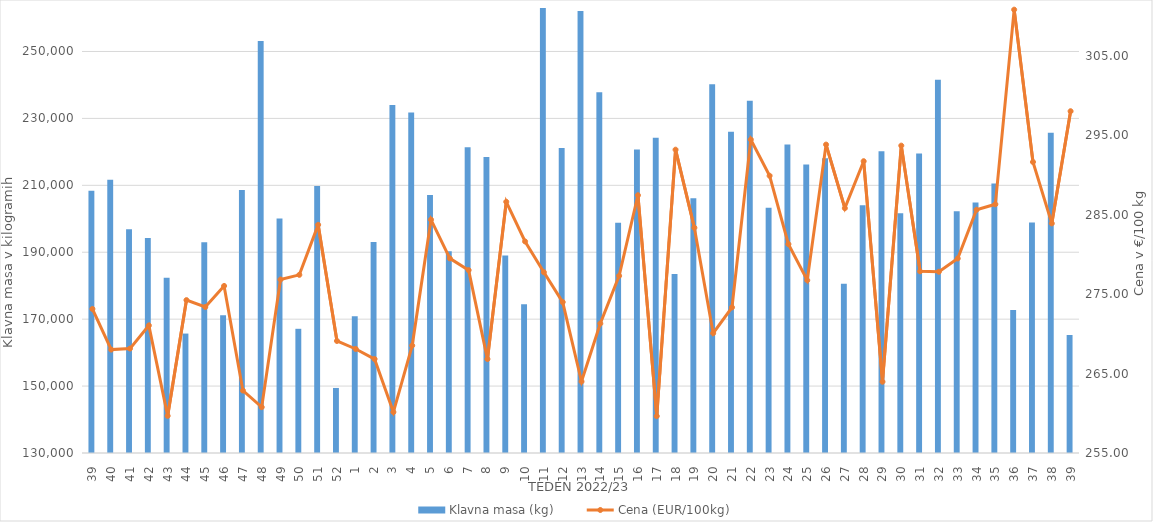
| Category | Klavna masa (kg) |
|---|---|
| 39.0 | 208403 |
| 40.0 | 211635 |
| 41.0 | 196841 |
| 42.0 | 194271 |
| 43.0 | 182399 |
| 44.0 | 165696 |
| 45.0 | 193022 |
| 46.0 | 171172 |
| 47.0 | 208597 |
| 48.0 | 253151 |
| 49.0 | 200117 |
| 50.0 | 167119 |
| 51.0 | 209797 |
| 52.0 | 149439 |
| 1.0 | 170843 |
| 2.0 | 193093 |
| 3.0 | 234042 |
| 4.0 | 231737 |
| 5.0 | 207136 |
| 6.0 | 190311 |
| 7.0 | 221366 |
| 8.0 | 218470 |
| 9.0 | 189006 |
| 10.0 | 174425 |
| 11.0 | 265476 |
| 12.0 | 221171 |
| 13.0 | 262102 |
| 14.0 | 237813 |
| 15.0 | 198828 |
| 16.0 | 220686 |
| 17.0 | 224192 |
| 18.0 | 183508 |
| 19.0 | 206133 |
| 20.0 | 240223 |
| 21.0 | 226050 |
| 22.0 | 235273 |
| 23.0 | 203306 |
| 24.0 | 222178 |
| 25.0 | 216259 |
| 26.0 | 218064 |
| 27.0 | 180556 |
| 28.0 | 204078 |
| 29.0 | 220162 |
| 30.0 | 201649 |
| 31.0 | 219538 |
| 32.0 | 241549 |
| 33.0 | 202261 |
| 34.0 | 204903 |
| 35.0 | 210575 |
| 36.0 | 172745 |
| 37.0 | 198877 |
| 38.0 | 225730 |
| 39.0 | 165273 |